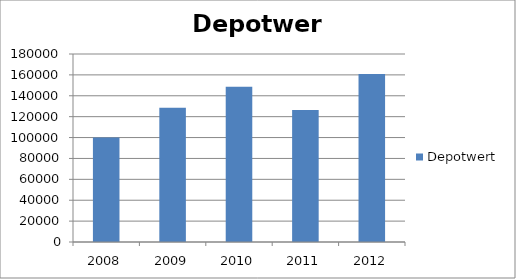
| Category | Depotwert |
|---|---|
| 2008.0 | 100000 |
| 2009.0 | 128451.52 |
| 2010.0 | 148577.36 |
| 2011.0 | 126397.13 |
| 2012.0 | 160913.17 |